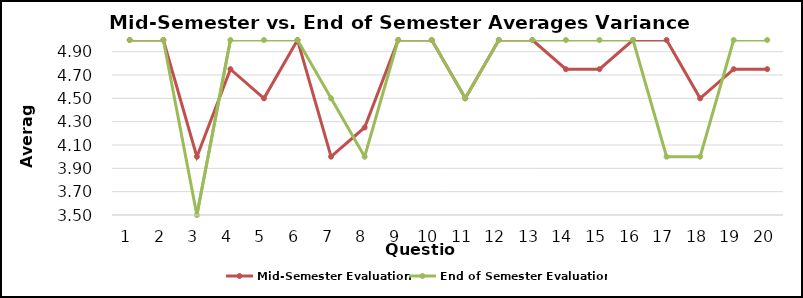
| Category | Mid-Semester Evaluation | End of Semester Evaluation |
|---|---|---|
| 0 | 5 | 5 |
| 1 | 5 | 5 |
| 2 | 4 | 3.5 |
| 3 | 4.75 | 5 |
| 4 | 4.5 | 5 |
| 5 | 5 | 5 |
| 6 | 4 | 4.5 |
| 7 | 4.25 | 4 |
| 8 | 5 | 5 |
| 9 | 5 | 5 |
| 10 | 4.5 | 4.5 |
| 11 | 5 | 5 |
| 12 | 5 | 5 |
| 13 | 4.75 | 5 |
| 14 | 4.75 | 5 |
| 15 | 5 | 5 |
| 16 | 5 | 4 |
| 17 | 4.5 | 4 |
| 18 | 4.75 | 5 |
| 19 | 4.75 | 5 |